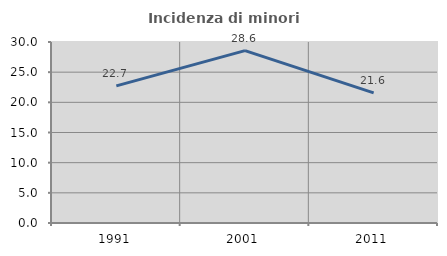
| Category | Incidenza di minori stranieri |
|---|---|
| 1991.0 | 22.727 |
| 2001.0 | 28.571 |
| 2011.0 | 21.561 |